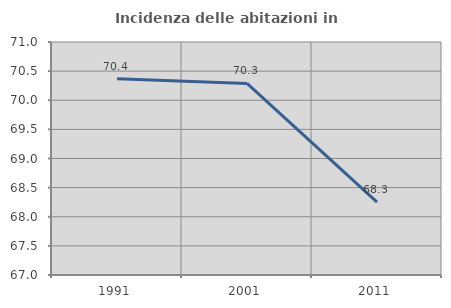
| Category | Incidenza delle abitazioni in proprietà  |
|---|---|
| 1991.0 | 70.37 |
| 2001.0 | 70.288 |
| 2011.0 | 68.25 |